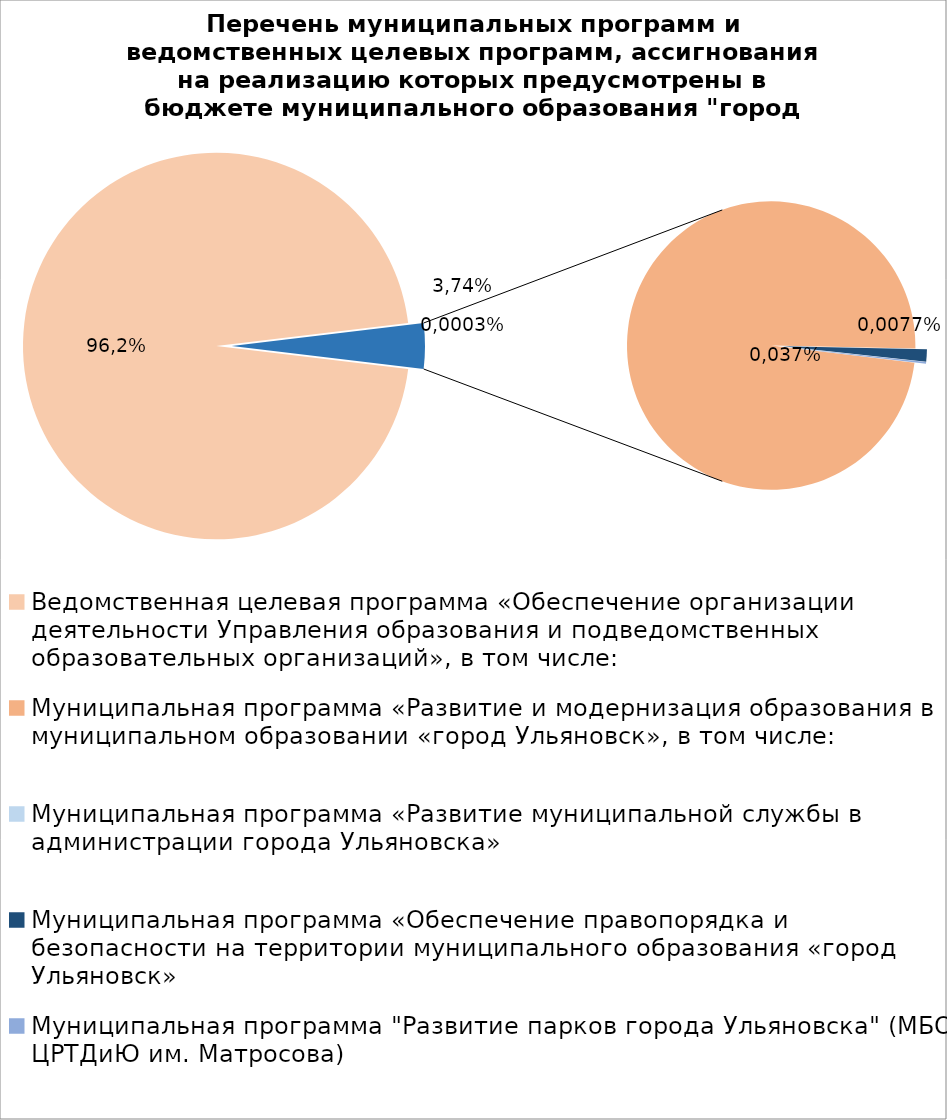
| Category | Series 0 |
|---|---|
| Ведомственная целевая программа «Обеспечение организации деятельности Управления образования и подведомственных образовательных организаций», в том числе: | 4978036.17 |
| Муниципальная программа «Развитие и модернизация образования в муниципальном образовании «город Ульяновск», в том числе: | 193238.59 |
| Муниципальная программа «Развитие муниципальной службы в администрации города Ульяновска» | 15.4 |
| Муниципальная программа «Обеспечение правопорядка и безопасности на территории муниципального образования «город Ульяновск» | 2700 |
| Муниципальная программа "Развитие парков города Ульяновска" (МБОУ ЦРТДиЮ им. Матросова) | 400 |